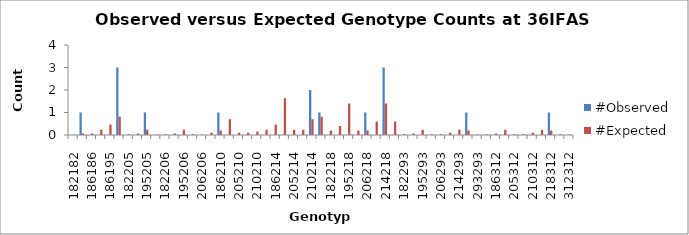
| Category | #Observed | #Expected |
|---|---|---|
| 182182.0 | 0 | 0.017 |
| 182186.0 | 1 | 0.067 |
| 186186.0 | 0 | 0.067 |
| 182195.0 | 0 | 0.233 |
| 186195.0 | 0 | 0.467 |
| 195195.0 | 3 | 0.817 |
| 182205.0 | 0 | 0.033 |
| 186205.0 | 0 | 0.067 |
| 195205.0 | 1 | 0.233 |
| 205205.0 | 0 | 0.017 |
| 182206.0 | 0 | 0.033 |
| 186206.0 | 0 | 0.067 |
| 195206.0 | 0 | 0.233 |
| 205206.0 | 0 | 0.033 |
| 206206.0 | 0 | 0.017 |
| 182210.0 | 0 | 0.1 |
| 186210.0 | 1 | 0.2 |
| 195210.0 | 0 | 0.7 |
| 205210.0 | 0 | 0.1 |
| 206210.0 | 0 | 0.1 |
| 210210.0 | 0 | 0.15 |
| 182214.0 | 0 | 0.233 |
| 186214.0 | 0 | 0.467 |
| 195214.0 | 0 | 1.633 |
| 205214.0 | 0 | 0.233 |
| 206214.0 | 0 | 0.233 |
| 210214.0 | 2 | 0.7 |
| 214214.0 | 1 | 0.817 |
| 182218.0 | 0 | 0.2 |
| 186218.0 | 0 | 0.4 |
| 195218.0 | 0 | 1.4 |
| 205218.0 | 0 | 0.2 |
| 206218.0 | 1 | 0.2 |
| 210218.0 | 0 | 0.6 |
| 214218.0 | 3 | 1.4 |
| 218218.0 | 0 | 0.6 |
| 182293.0 | 0 | 0.033 |
| 186293.0 | 0 | 0.067 |
| 195293.0 | 0 | 0.233 |
| 205293.0 | 0 | 0.033 |
| 206293.0 | 0 | 0.033 |
| 210293.0 | 0 | 0.1 |
| 214293.0 | 0 | 0.233 |
| 218293.0 | 1 | 0.2 |
| 293293.0 | 0 | 0.017 |
| 182312.0 | 0 | 0.033 |
| 186312.0 | 0 | 0.067 |
| 195312.0 | 0 | 0.233 |
| 205312.0 | 0 | 0.033 |
| 206312.0 | 0 | 0.033 |
| 210312.0 | 0 | 0.1 |
| 214312.0 | 0 | 0.233 |
| 218312.0 | 1 | 0.2 |
| 293312.0 | 0 | 0.033 |
| 312312.0 | 0 | 0.017 |